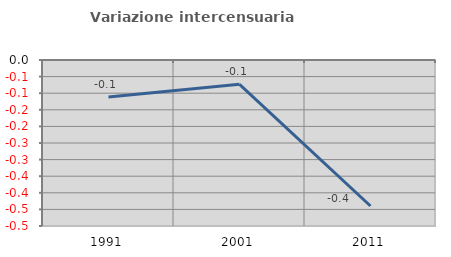
| Category | Variazione intercensuaria annua |
|---|---|
| 1991.0 | -0.111 |
| 2001.0 | -0.073 |
| 2011.0 | -0.44 |